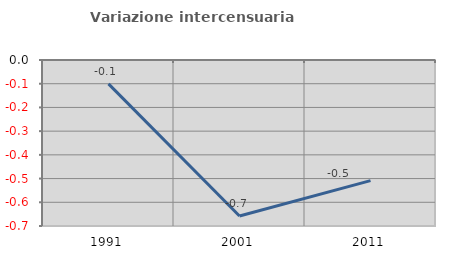
| Category | Variazione intercensuaria annua |
|---|---|
| 1991.0 | -0.101 |
| 2001.0 | -0.658 |
| 2011.0 | -0.509 |